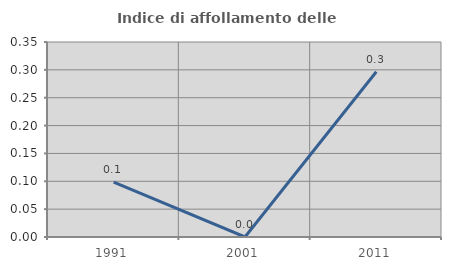
| Category | Indice di affollamento delle abitazioni  |
|---|---|
| 1991.0 | 0.099 |
| 2001.0 | 0 |
| 2011.0 | 0.297 |